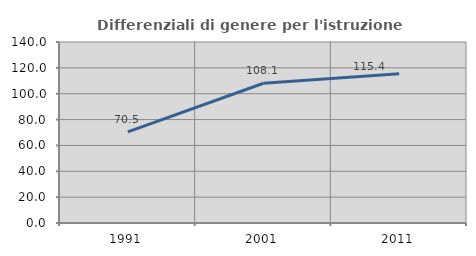
| Category | Differenziali di genere per l'istruzione superiore |
|---|---|
| 1991.0 | 70.521 |
| 2001.0 | 108.074 |
| 2011.0 | 115.438 |